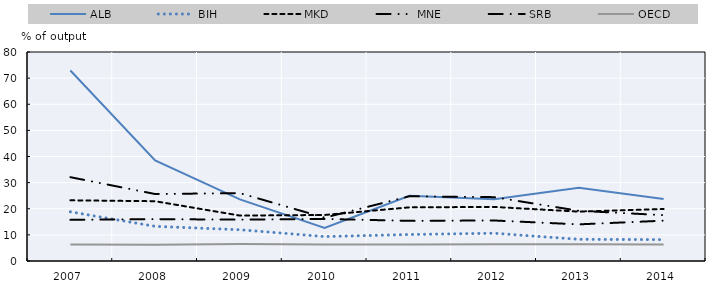
| Category | ALB | BIH | MKD | MNE | SRB | OECD |
|---|---|---|---|---|---|---|
| 2007.0 | 72.902 | 18.822 | 23.223 | 32.09 | 15.767 | 6.343 |
| 2008.0 | 38.53 | 13.263 | 22.881 | 25.636 | 16.027 | 6.241 |
| 2009.0 | 23.587 | 11.967 | 17.384 | 25.978 | 15.83 | 6.541 |
| 2010.0 | 12.659 | 9.355 | 17.617 | 16.584 | 16.097 | 6.334 |
| 2011.0 | 24.934 | 10.137 | 20.536 | 24.774 | 15.369 | 6.336 |
| 2012.0 | 23.683 | 10.623 | 20.696 | 24.437 | 15.507 | 6.427 |
| 2013.0 | 27.993 | 8.298 | 18.904 | 19.214 | 14.024 | 6.366 |
| 2014.0 | 23.688 | 8.181 | 19.892 | 17.549 | 15.437 | 6.307 |